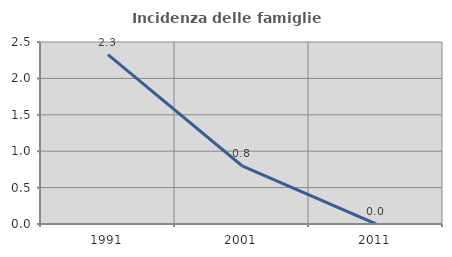
| Category | Incidenza delle famiglie numerose |
|---|---|
| 1991.0 | 2.326 |
| 2001.0 | 0.8 |
| 2011.0 | 0 |